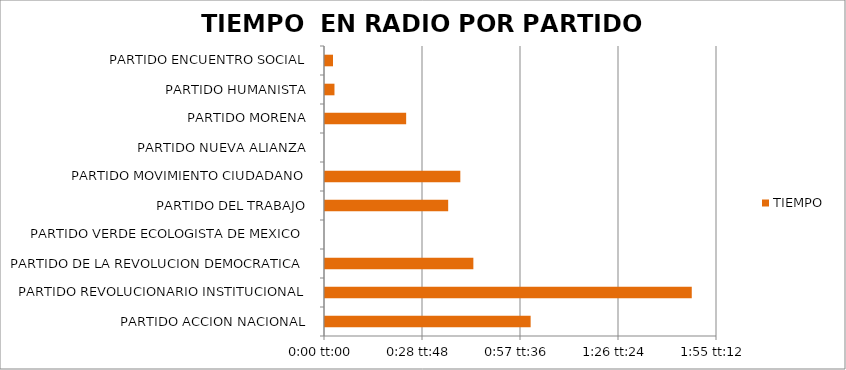
| Category | TIEMPO  |
|---|---|
| PARTIDO ACCION NACIONAL | 0.042 |
| PARTIDO REVOLUCIONARIO INSTITUCIONAL | 0.075 |
| PARTIDO DE LA REVOLUCION DEMOCRATICA | 0.03 |
| PARTIDO VERDE ECOLOGISTA DE MEXICO | 0 |
| PARTIDO DEL TRABAJO | 0.025 |
| PARTIDO MOVIMIENTO CIUDADANO | 0.028 |
| PARTIDO NUEVA ALIANZA | 0 |
| PARTIDO MORENA | 0.017 |
| PARTIDO HUMANISTA | 0.002 |
| PARTIDO ENCUENTRO SOCIAL | 0.002 |